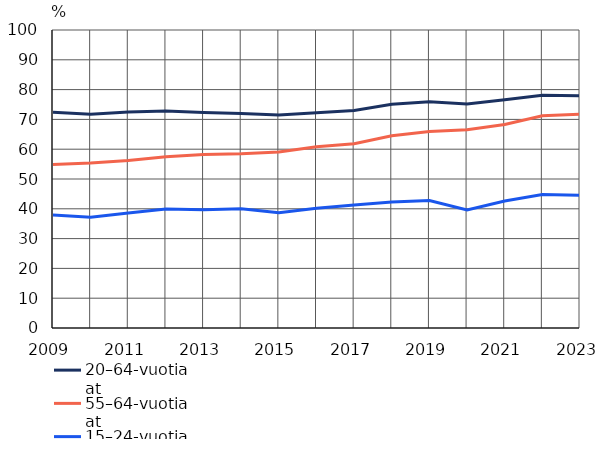
| Category | 20–64-vuotiaat | 55–64-vuotiaat | 15–24-vuotiaat |
|---|---|---|---|
| 2009 | 72.4 | 54.9 | 37.9 |
| 2010 | 71.7 | 55.4 | 37.2 |
| 2011 | 72.5 | 56.2 | 38.6 |
| 2012 | 72.8 | 57.5 | 39.9 |
| 2013 | 72.3 | 58.2 | 39.7 |
| 2014 | 72 | 58.5 | 40 |
| 2015 | 71.5 | 59.1 | 38.7 |
| 2016 | 72.2 | 60.8 | 40.2 |
| 2017 | 73 | 61.8 | 41.3 |
| 2018 | 75.1 | 64.5 | 42.3 |
| 2019 | 75.9 | 65.9 | 42.8 |
| 2020 | 75.2 | 66.5 | 39.6 |
| 2021 | 76.6 | 68.3 | 42.6 |
| 2022 | 78.1 | 71.2 | 44.8 |
| 2023 | 77.9 | 71.7 | 44.5 |